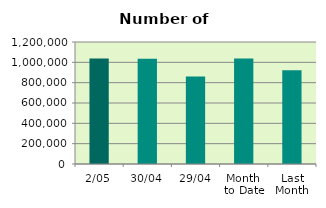
| Category | Series 0 |
|---|---|
| 2/05 | 1038430 |
| 30/04 | 1034372 |
| 29/04 | 861742 |
| Month 
to Date | 1038430 |
| Last
Month | 921109.3 |